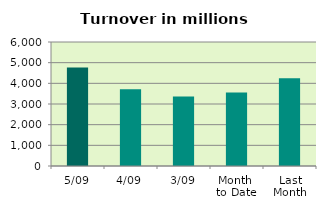
| Category | Series 0 |
|---|---|
| 5/09 | 4766.749 |
| 4/09 | 3713.109 |
| 3/09 | 3366.861 |
| Month 
to Date | 3557.754 |
| Last
Month | 4240.294 |